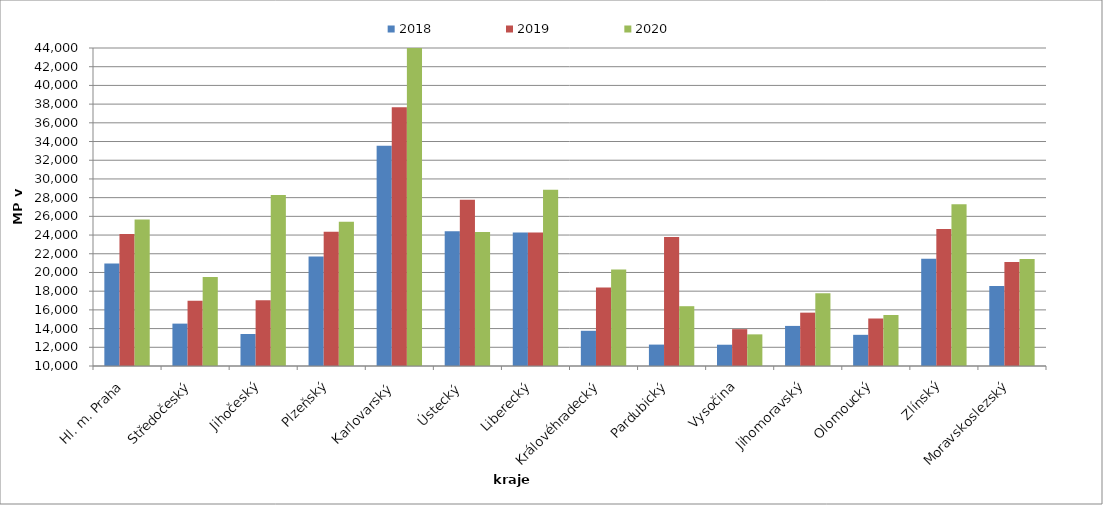
| Category | 2018 | 2019 | 2020 |
|---|---|---|---|
| Hl. m. Praha | 20970.106 | 24120.462 | 25668.462 |
| Středočeský | 14530.837 | 16982.35 | 19528.51 |
| Jihočeský | 13419.031 | 17020.964 | 28272.979 |
| Plzeňský | 21698.334 | 24363.392 | 25428.401 |
| Karlovarský  | 33547.126 | 37673.563 | 44180 |
| Ústecký   | 24398.74 | 27763.139 | 24325.499 |
| Liberecký | 24273.023 | 24273.023 | 28834.429 |
| Královéhradecký | 13765.384 | 18391.425 | 20321.35 |
| Pardubický | 12288.801 | 23793.196 | 16393.683 |
| Vysočina | 12274.34 | 13938.351 | 13383.138 |
| Jihomoravský | 14285.814 | 15704.776 | 17781.08 |
| Olomoucký | 13332.918 | 15078.01 | 15451.925 |
| Zlínský | 21477.305 | 24635.271 | 27302.017 |
| Moravskoslezský | 18552.59 | 21123.029 | 21441.978 |